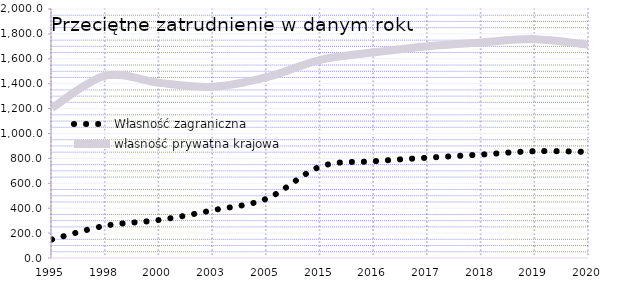
| Category | Własność zagraniczna | własność prywatna krajowa |
|---|---|---|
| 1995 | 149.1 | 1205.8 |
| 1998 | 259.7 | 1464.5 |
| 2000 | 305.7 | 1406.6 |
| 2003 | 384 | 1375 |
| 2005 | 477.2 | 1451.9 |
| 2015 | 734.5 | 1592.1 |
| 2016 | 777.2 | 1652.4 |
| 2017 | 805.8 | 1701.3 |
| 2018 | 831.1 | 1731.9 |
| 2019 | 858.1 | 1758 |
| 2020 | 852 | 1712.9 |